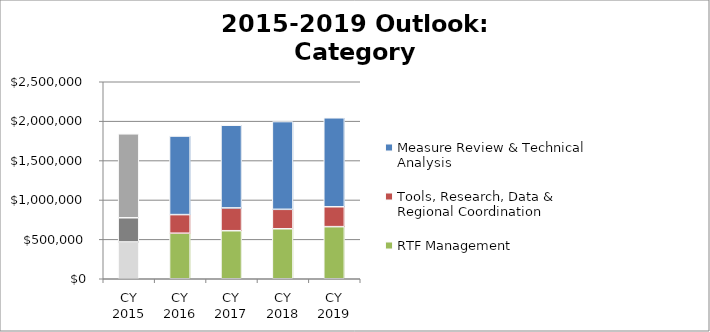
| Category | RTF Management | Tools, Research, Data & Regional Coordination | Measure Review & Technical Analysis |
|---|---|---|---|
| CY 2015 | 467100 | 307000 | 1065100 |
| CY 2016 | 578000 | 236000 | 997100 |
| CY 2017 | 609700 | 289500 | 1049200 |
| CY 2018 | 634300 | 246700 | 1113800 |
| CY 2019 | 661100 | 252800 | 1128700 |